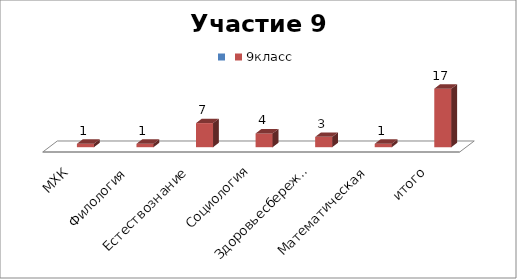
| Category | Series 0 | 9класс |
|---|---|---|
| МХК |  | 1 |
| Филология |  | 1 |
| Естествознание |  | 7 |
| Социология |  | 4 |
| Здоровьесбережение |  | 3 |
| Математическая |  | 1 |
| итого |  | 17 |